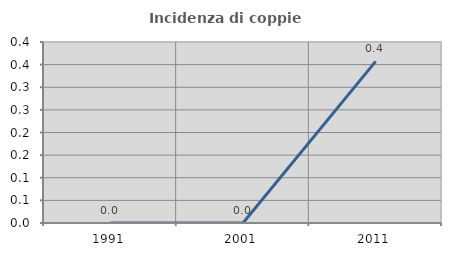
| Category | Incidenza di coppie miste |
|---|---|
| 1991.0 | 0 |
| 2001.0 | 0 |
| 2011.0 | 0.357 |